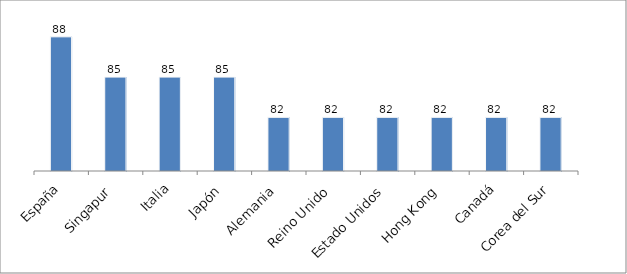
| Category | Penetración móvil |
|---|---|
| España | 88 |
| Singapur | 85 |
| Italia | 85 |
| Japón | 85 |
| Alemania | 82 |
| Reino Unido | 82 |
| Estado Unidos | 82 |
| Hong Kong | 82 |
| Canadá | 82 |
| Corea del Sur | 82 |